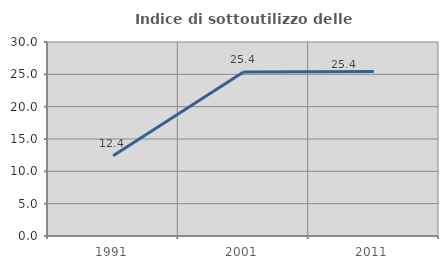
| Category | Indice di sottoutilizzo delle abitazioni  |
|---|---|
| 1991.0 | 12.413 |
| 2001.0 | 25.368 |
| 2011.0 | 25.421 |